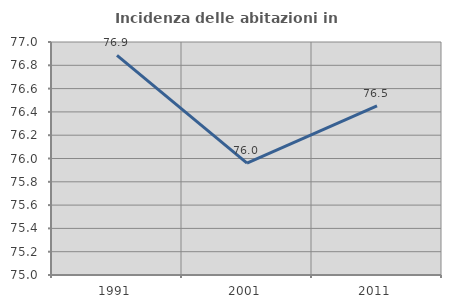
| Category | Incidenza delle abitazioni in proprietà  |
|---|---|
| 1991.0 | 76.884 |
| 2001.0 | 75.961 |
| 2011.0 | 76.452 |